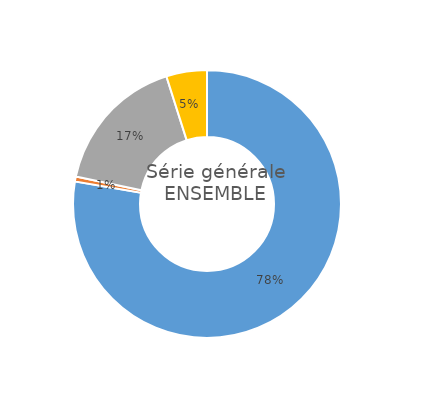
| Category | Series 0 |
|---|---|
| ... ayant validé la maîtrise du socle, et obtenu une moyenne aux épreuves terminales supérieure ou égale à 10/20 | 77.7 |
| ... n'ayant pas validé la maîtrise du socle, et obtenu une moyenne aux épreuves terminales supérieure ou égale à 10/20 | 0.6 |
| ... ayant validé la maîtrise du socle, et obtenu une moyenne aux épreuves terminales inférieure à 10/20 | 16.8 |
| ... n'ayant pas validé la maîtrise du socle, et obtenu une moyenne aux épreuves terminales inférieure à 10/20 | 4.9 |